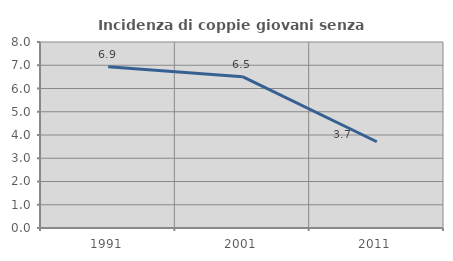
| Category | Incidenza di coppie giovani senza figli |
|---|---|
| 1991.0 | 6.941 |
| 2001.0 | 6.508 |
| 2011.0 | 3.709 |